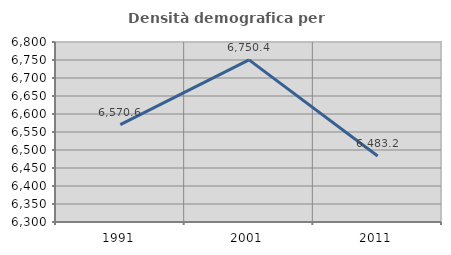
| Category | Densità demografica |
|---|---|
| 1991.0 | 6570.63 |
| 2001.0 | 6750.42 |
| 2011.0 | 6483.249 |